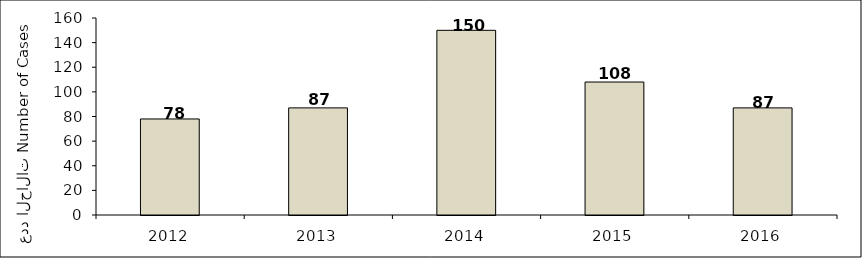
| Category | Series 0 |
|---|---|
| 2012.0 | 78 |
| 2013.0 | 87 |
| 2014.0 | 150 |
| 2015.0 | 108 |
| 2016.0 | 87 |